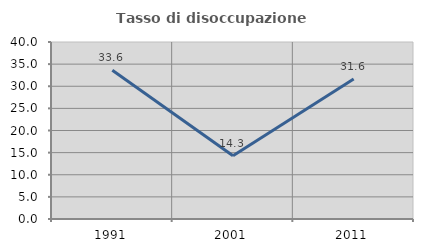
| Category | Tasso di disoccupazione giovanile  |
|---|---|
| 1991.0 | 33.607 |
| 2001.0 | 14.286 |
| 2011.0 | 31.633 |